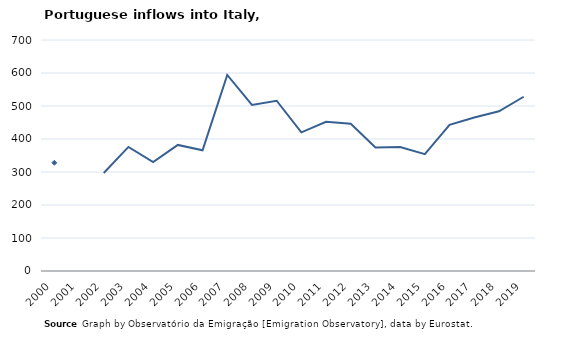
| Category | Entradas |
|---|---|
| 2000.0 | 328 |
| 2001.0 | 0 |
| 2002.0 | 297 |
| 2003.0 | 376 |
| 2004.0 | 330 |
| 2005.0 | 382 |
| 2006.0 | 366 |
| 2007.0 | 594 |
| 2008.0 | 503 |
| 2009.0 | 516 |
| 2010.0 | 420 |
| 2011.0 | 452 |
| 2012.0 | 446 |
| 2013.0 | 374 |
| 2014.0 | 376 |
| 2015.0 | 354 |
| 2016.0 | 443 |
| 2017.0 | 465 |
| 2018.0 | 484 |
| 2019.0 | 528 |